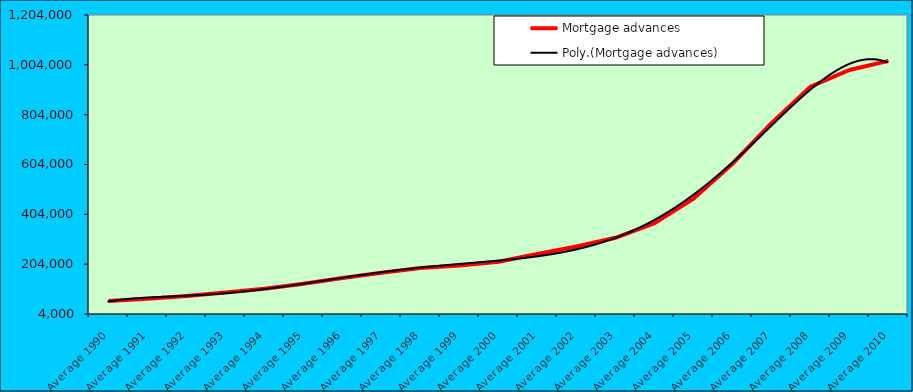
| Category | Mortgage advances |
|---|---|
| Average 1990 | 55774.333 |
| Average 1991 | 65278.083 |
| Average 1992 | 76558.167 |
| Average 1993 | 90123.417 |
| Average 1994 | 105359.333 |
| Average 1995 | 125662.167 |
| Average 1996 | 148595 |
| Average 1997 | 169484.833 |
| Average 1998 | 188294.75 |
| Average 1999 | 198923.818 |
| Average 2000 | 213769.583 |
| Average 2001 | 244476.636 |
| Average 2002 | 274873.333 |
| Average 2003 | 309819.333 |
| Average 2004 | 368591.917 |
| Average 2005 | 467276.583 |
| Average 2006 | 606976.583 |
| Average 2007 | 769995.917 |
| Average 2008 | 916337.333 |
| Average 2009 | 983455.583 |
| Average 2010 | 1019706.375 |